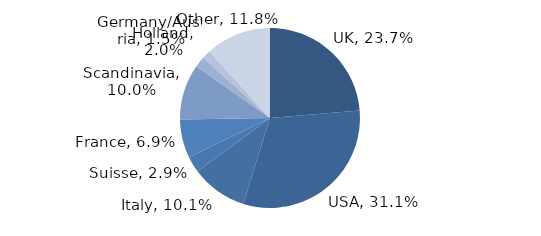
| Category | Investment Style |
|---|---|
| UK | 0.237 |
| USA | 0.311 |
| Italy | 0.101 |
| Suisse | 0.029 |
| France | 0.069 |
| Scandinavia | 0.1 |
| Holland | 0.02 |
| Germany/Austria | 0.015 |
| Other | 0.118 |